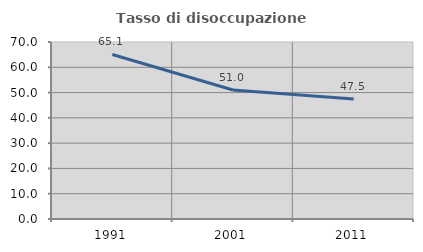
| Category | Tasso di disoccupazione giovanile  |
|---|---|
| 1991.0 | 65.067 |
| 2001.0 | 51.014 |
| 2011.0 | 47.496 |